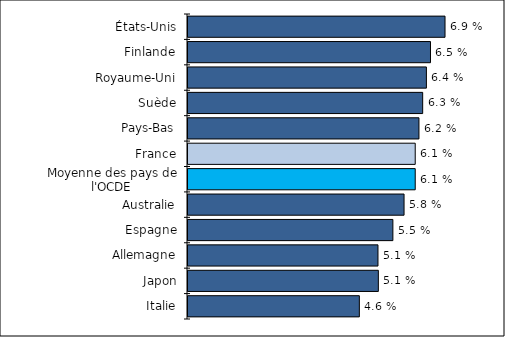
| Category | Series 0 |
|---|---|
| Italie | 4.6 |
| Japon | 5.11 |
| Allemagne | 5.1 |
| Espagne | 5.5 |
| Australie | 5.8 |
| Moyenne des pays de l'OCDE | 6.1 |
| France | 6.1 |
| Pays-Bas | 6.2 |
| Suède | 6.3 |
| Royaume-Uni | 6.4 |
| Finlande | 6.51 |
| États-Unis | 6.9 |